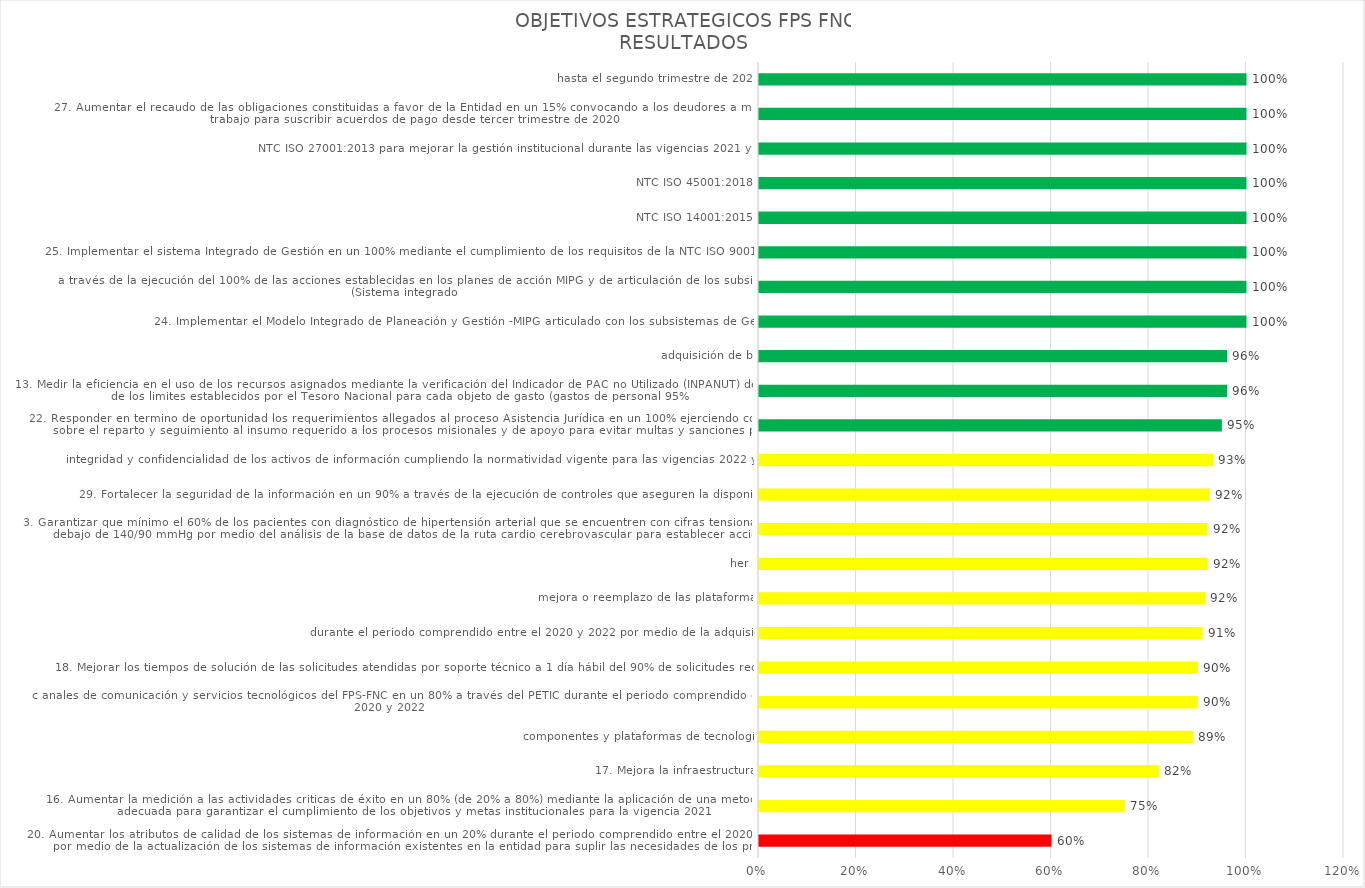
| Category | Total |
|---|---|
| 20. Aumentar los atributos de calidad de los sistemas de información en un 20% durante el periodo comprendido entre el 2020 y 2022 por medio de la actualización de los sistemas de información existentes en la entidad para suplir las necesidades de los proc | 0.6 |
| 16. Aumentar la medición a las actividades criticas de éxito en un 80% (de 20% a 80%) mediante la aplicación de una metodología adecuada para garantizar el cumplimiento de los objetivos y metas institucionales para la vigencia 2021 | 0.75 |
| 17. Mejora la infraestructura, componentes y plataformas de tecnología, c anales de comunicación y servicios tecnológicos del FPS-FNC en un 80% a través del PETIC durante el periodo comprendido entre el 2020 y 2022  | 0.82 |
| 18. Mejorar los tiempos de solución de las solicitudes atendidas por soporte técnico a 1 día hábil del 90% de solicitudes recibidas, durante el periodo comprendido entre el 2020 y 2022 por medio de la adquisición, mejora o reemplazo de las plataformas, her | 0.89 |
| 3. Garantizar que mínimo el 60% de los pacientes con diagnóstico de hipertensión arterial que se encuentren con cifras tensionales por debajo de 140/90 mmHg por medio del análisis de la base de datos de la ruta cardio cerebrovascular para establecer accion | 0.9 |
| 29. Fortalecer la seguridad de la información en un 90% a través de la ejecución de controles que aseguren la disponibilidad, integridad y confidencialidad de los activos de información cumpliendo la normatividad vigente para las vigencias 2022 y 2023 | 0.9 |
| 22. Responder en termino de oportunidad los requerimientos allegados al proceso Asistencia Jurídica en un 100% ejerciendo controles sobre el reparto y seguimiento al insumo requerido a los procesos misionales y de apoyo para evitar multas y sanciones por l | 0.91 |
| 13. Medir la eficiencia en el uso de los recursos asignados mediante la verificación del Indicador de PAC no Utilizado (INPANUT) del 100% de los limites establecidos por el Tesoro Nacional para cada objeto de gasto (gastos de personal 95%, adquisición de b | 0.915 |
| 24. Implementar el Modelo Integrado de Planeación y Gestión -MIPG articulado con los subsistemas de Gestión, a través de la ejecución del 100% de las acciones establecidas en los planes de acción MIPG y de articulación de los subsistemas (Sistema integrado | 0.92 |
| 25. Implementar el sistema Integrado de Gestión en un 100% mediante el cumplimiento de los requisitos de la NTC ISO 9001:2015, NTC ISO 14001:2015, NTC ISO 45001:2018, NTC ISO 27001:2013 para mejorar la gestión institucional durante las vigencias 2021 y 202 | 0.92 |
| 27. Aumentar el recaudo de las obligaciones constituidas a favor de la Entidad en un 15% convocando a los deudores a mesas de trabajo para suscribir acuerdos de pago desde tercer trimestre de 2020, hasta el segundo trimestre de 2021 | 0.924 |
| 6. Aumentar la solicitud de trámites en línea por medio de la página web en un 70%, con el fin de que los usuarios tengan la posibilidad de realizar las solicitudes por medio virtual y no presencial para prepararnos ante cualquier contingencia como la Emer | 0.931 |
| 4. Tamizar al mínimo el 50% de las mujeres para la identificación temprana de cáncer de cuello uterino de acuerdo al esquema por medio del análisis de la base de datos de la ruta promoción y mantenimiento de la salud para establecer acciones encaminadas a  | 0.95 |
| 2. Realizar revisión constante a todas las encuestas de satisfacción postramite realizadas por el personal de atención al ciudadano para hacer seguimiento a las que tengan baja calificación y aplicar medidas correctivas en los cuatro trimestres del año | 0.96 |
| 5. Mantener informado a los usuarios en su totalidad (100%) a través de la adquisición de un software moderno que permita determinar oportunamente el estado de las PQRSD en un tiempo máximo de 5 minutos | 0.96 |
| 28. Realizar el análisis de viabilidad que permita identificar el 100% de las necesidades institucionales, mediante el estudio técnico que conlleve al rediseño organizacional en los próximos 2 años. | 1 |
| 10. Registrar oportunamente y con razonabilidad del 100% los hechos económicos de la entidad utilizando como herramienta tecnológica administrada por el SIIF Nación con el fin de proporcionar estados financieros bajo la normatividad existente de manera men | 1 |
| 15. Presentar al archivo general de la nación la totalidad de las tablas de retención documental para que en un periodo no mayor a 90 días sean aprobadas y convalidadas y poderlas aplicar al archivo del FPS | 1 |
| 7. Fomentar la implementación de las políticas institucionales en un 100%, orientado a satisfacer las necesidades identificadas para la gestión estratégica del Talento Humano, mediante la aplicación de los lineamientos y metodologías emitidas por el DAFP,  | 1 |
| 21. Aumentar el control de trámites a los de los funcionarios y contratistas del proceso en un 10% (del 75% al 85%) a través de los informes de gestión que se presentan diariamente, para contrarrestar la imposición de sanciones por autoridades judiciales o | 1 |
| 8. Administrar los bienes transferidos por la extinta empresa Ferrocarriles Nacionales en su totalidad, que actualmente tiene en propiedad la Entidad, solicitando presupuesto, un sistema de inventarios y un equipo de trabajo idóneo, para la administración  | 1 |
| 14. Garantizar el cumplimiento a las exigencias de ley y/o solicitudes formales realizadas por los entes de control y otras entidades. | 1 |
| 9. Garantizar el principio de transparencia dentro de los procesos de contratación a través de la utilización de los recursos y herramientas que dispone el gobierno para asegurar el uso eficiente de los recursos financieros. | 1 |